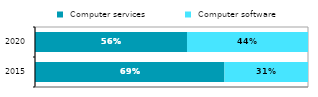
| Category |  Computer services |  Computer software |
|---|---|---|
|  2015 | 0.694 | 0.306 |
|  2020 | 0.557 | 0.443 |